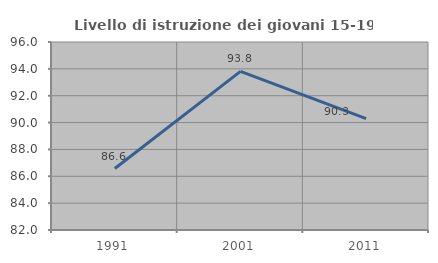
| Category | Livello di istruzione dei giovani 15-19 anni |
|---|---|
| 1991.0 | 86.576 |
| 2001.0 | 93.811 |
| 2011.0 | 90.291 |